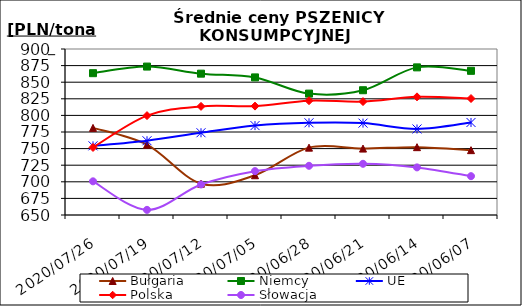
| Category | Bułgaria | Niemcy | UE | Polska | Słowacja |
|---|---|---|---|---|---|
| 2020-07-26 | 781.194 | 863.573 | 754.168 | 751.663 | 700.69 |
| 2020-07-19 | 755.845 | 873.53 | 761.825 | 799.676 | 657.746 |
| 2020-07-12 | 697.19 | 862.845 | 773.886 | 813.582 | 695.954 |
| 2020-07-05 | 709.887 | 857.222 | 784.633 | 814 | 716.049 |
| 2020-06-28 | 751.451 | 832.823 | 788.856 | 822.13 | 724.111 |
| 2020-06-21 | 750.017 | 837.901 | 788.375 | 820.824 | 727.129 |
| 2020-06-14 | 752.168 | 872.337 | 779.562 | 827.945 | 721.681 |
| 2020-06-07 | 747.673 | 867.124 | 789.332 | 825.391 | 708.475 |